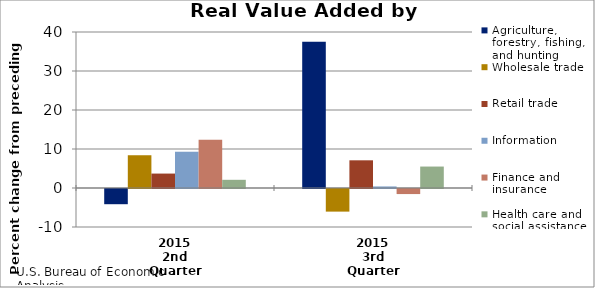
| Category | Agriculture, forestry, fishing, and hunting | Wholesale trade | Retail trade | Information | Finance and insurance | Health care and social assistance |
|---|---|---|---|---|---|---|
| 2015
2nd Quarter | -3.9 | 8.4 | 3.7 | 9.3 | 12.4 | 2.1 |
| 2015
3rd Quarter | 37.5 | -5.8 | 7.1 | 0.4 | -1.3 | 5.5 |